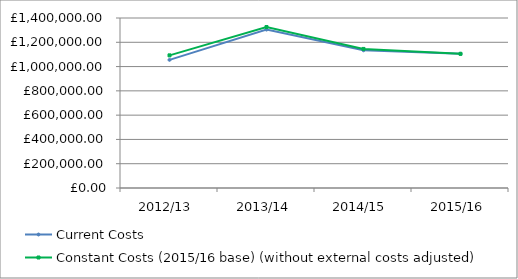
| Category | Current Costs | Constant Costs (2015/16 base) (without external costs adjusted) |
|---|---|---|
| 2012/13 | 1055096.202 | 1092235.243 |
| 2013/14 | 1304287.572 | 1325774.32 |
| 2014/15 | 1134160.523 | 1145227.809 |
| 2015/16 | 1105063.659 | 1105063.659 |